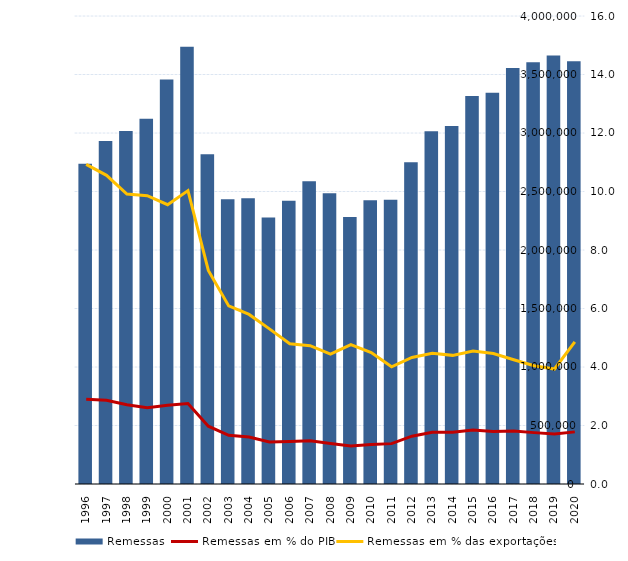
| Category | Remessas |
|---|---|
| 1996.0 | 2737490 |
| 1997.0 | 2932550 |
| 1998.0 | 3016290 |
| 1999.0 | 3121680 |
| 2000.0 | 3458120 |
| 2001.0 | 3736820 |
| 2002.0 | 2817880 |
| 2003.0 | 2433780 |
| 2004.0 | 2442160 |
| 2005.0 | 2277250 |
| 2006.0 | 2420270 |
| 2007.0 | 2588420 |
| 2008.0 | 2484680 |
| 2009.0 | 2281870 |
| 2010.0 | 2425900 |
| 2011.0 | 2430490 |
| 2012.0 | 2749460 |
| 2013.0 | 3015780 |
| 2014.0 | 3060710 |
| 2015.0 | 3315620 |
| 2016.0 | 3343200 |
| 2017.0 | 3554750 |
| 2018.0 | 3604010 |
| 2019.0 | 3662130 |
| 2020.0 | 3612860 |